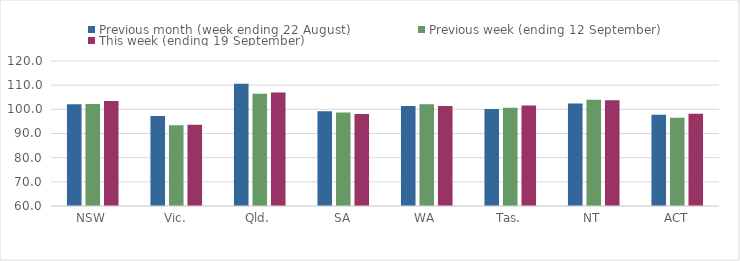
| Category | Previous month (week ending 22 August) | Previous week (ending 12 September) | This week (ending 19 September) |
|---|---|---|---|
| NSW | 102.07 | 102.22 | 103.43 |
| Vic. | 97.21 | 93.46 | 93.59 |
| Qld. | 110.62 | 106.44 | 106.93 |
| SA | 99.21 | 98.72 | 98.05 |
| WA | 101.36 | 102.14 | 101.38 |
| Tas. | 100.13 | 100.64 | 101.63 |
| NT | 102.43 | 103.92 | 103.78 |
| ACT | 97.74 | 96.48 | 98.13 |